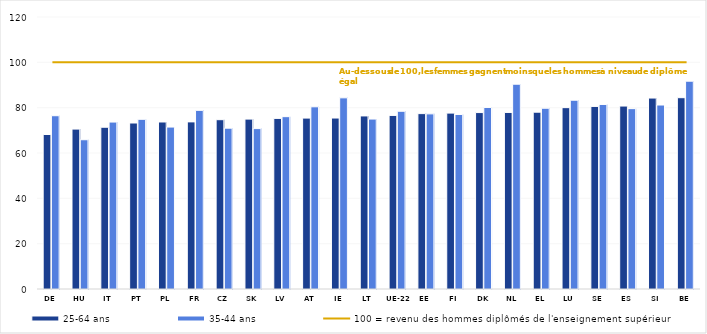
| Category | 25-64 ans | 35-44 ans |
|---|---|---|
| DE | 68.158 | 76.442 |
| HU | 70.542 | 65.846 |
| IT | 71.365 | 73.643 |
| PT | 73.234 | 74.859 |
| PL | 73.681 | 71.442 |
| FR | 73.729 | 78.806 |
| CZ | 74.69 | 70.956 |
| SK | 74.95 | 70.764 |
| LV | 75.273 | 76.034 |
| AT | 75.393 | 80.378 |
| IE | 75.427 | 84.334 |
| LT | 76.352 | 74.972 |
| UE-22 | 76.573 | 78.408 |
| EE | 77.373 | 77.266 |
| FI | 77.593 | 76.993 |
| DK | 77.835 | 80.095 |
| NL | 77.891 | 90.356 |
| EL | 78.01 | 79.752 |
| LU | 80.006 | 83.286 |
| SE | 80.547 | 81.411 |
| ES | 80.708 | 79.57 |
| SI | 84.241 | 81.168 |
| BE | 84.4 | 91.685 |